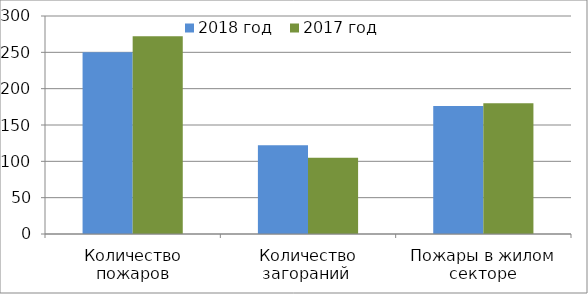
| Category | 2018 год | 2017 год |
|---|---|---|
| Количество пожаров | 250 | 272 |
| Количество загораний  | 122 | 105 |
| Пожары в жилом секторе | 176 | 180 |